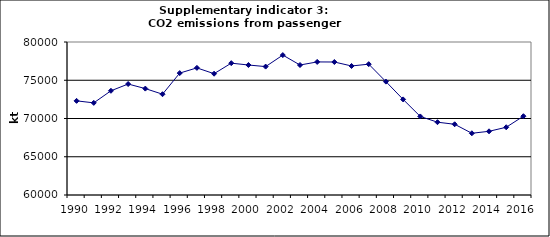
| Category | CO2 emissions from passenger cars, kt |
|---|---|
| 1990 | 72306.299 |
| 1991 | 72044.231 |
| 1992 | 73622.748 |
| 1993 | 74506.21 |
| 1994 | 73908.479 |
| 1995 | 73175.566 |
| 1996 | 75933.486 |
| 1997 | 76616.246 |
| 1998 | 75856.057 |
| 1999 | 77233.04 |
| 2000 | 76991.423 |
| 2001 | 76783.652 |
| 2002 | 78290.302 |
| 2003 | 76992.581 |
| 2004 | 77394.254 |
| 2005 | 77385.061 |
| 2006 | 76865.304 |
| 2007 | 77101.985 |
| 2008 | 74822.078 |
| 2009 | 72497.64 |
| 2010 | 70268.931 |
| 2011 | 69517.903 |
| 2012 | 69245.386 |
| 2013 | 68068.503 |
| 2014 | 68326.958 |
| 2015 | 68855.018 |
| 2016 | 70301.956 |